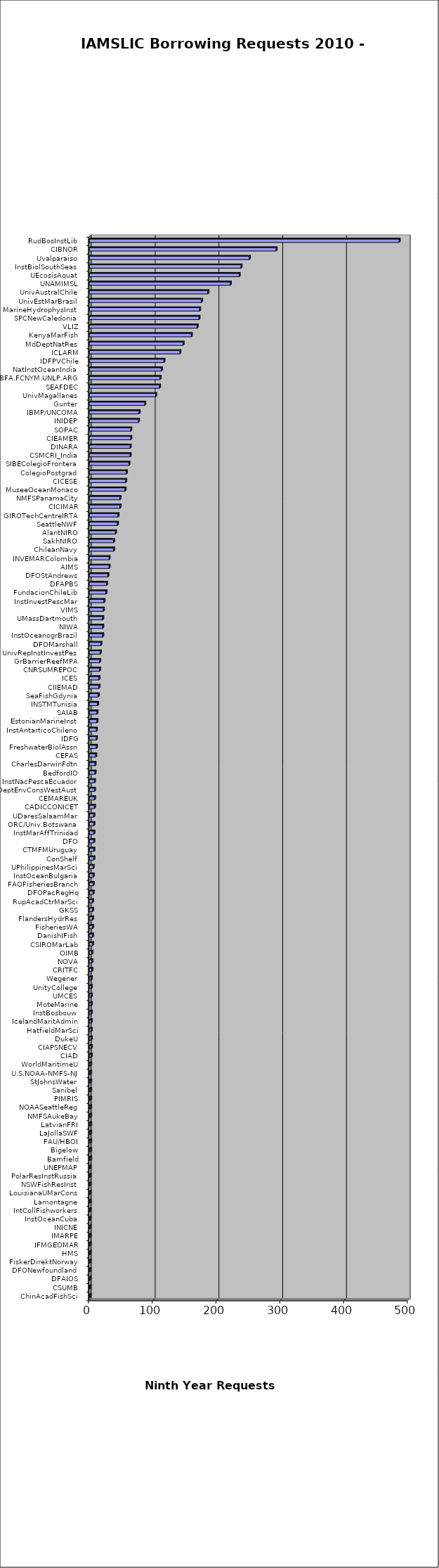
| Category | Series 0 |
|---|---|
| ChinAcadFishSci  | 1 |
| CSUMB  | 1 |
| DFAIOS  | 1 |
| DFONewfoundland  | 1 |
| FiskerDirektNorway  | 1 |
| HMS  | 1 |
| IFMGEOMAR  | 1 |
| IMARPE  | 1 |
| INICNE  | 1 |
| InstOceanCuba  | 1 |
| IntCollFishworkers  | 1 |
| Lamontagne  | 1 |
| LouisianaUMarCons  | 1 |
| NSWFishResInst  | 1 |
| PolarResInstRussia  | 1 |
| UNEPMAP  | 1 |
| Bamfield  | 2 |
| Bigelow  | 2 |
| FAU/HBOI  | 2 |
| LaJollaSWF  | 2 |
| LatvianFRI  | 2 |
| NMFSAukeBay  | 2 |
| NOAASeattleReg  | 2 |
| PIMRIS  | 2 |
| Sanibel  | 2 |
| StJohnsWater  | 2 |
| U.S.NOAA-NMFS-NJ  | 2 |
| WorldMaritimeU  | 2 |
| CIAD  | 3 |
| CIAPSNECV  | 3 |
| DukeU  | 3 |
| HatfieldMarSci  | 3 |
| IcelandMaritAdmin  | 3 |
| InstBosbouw  | 3 |
| MoteMarine  | 3 |
| UMCES  | 3 |
| UnityCollege  | 3 |
| Wegener  | 3 |
| CRITFC  | 4 |
| NOVA  | 4 |
| OIMB  | 4 |
| CSIROMarLab  | 5 |
| DanishIFish  | 5 |
| FisheriesWA  | 5 |
| FlandersHydrRes  | 5 |
| GKSS  | 5 |
| RupAcadCtrMarSci  | 5 |
| DFOPacRegHq  | 6 |
| FAOFisheriesBranch  | 6 |
| InstOceanBulgaria  | 6 |
| UPhilippinesMarSci  | 6 |
| ConShelf  | 7 |
| CTMFMUruguay  | 7 |
| DFO  | 7 |
| InstMarAffTrinidad  | 7 |
| ORC/Univ.Botswana  | 7 |
| UDaresSalaamMar  | 7 |
| CADICCONICET  | 8 |
| CEMAREUK  | 8 |
| DeptEnvConsWestAust  | 8 |
| InstNacPescaEcuador  | 8 |
| BedfordIO  | 9 |
| CharlesDarwinFdtn  | 9 |
| CEFAS  | 10 |
| FreshwaterBiolAssn  | 11 |
| IDFG  | 11 |
| InstAntarticoChileno  | 11 |
| EstonianMarineInst  | 12 |
| SAIAB  | 12 |
| INSTMTunisia  | 13 |
| SeaFishGdynia  | 14 |
| CIIEMAD  | 15 |
| ICES  | 15 |
| CNRSUMREPOC  | 16 |
| GrBarrierReefMPA  | 16 |
| UnivRepInstInvestPes  | 17 |
| DFOMarshall  | 18 |
| InstOceanogrBrazil  | 21 |
| NIWA  | 21 |
| UMassDartmouth  | 21 |
| VIMS  | 22 |
| InstInvestPescMar  | 23 |
| FundacionChileLib  | 26 |
| DFAPBS  | 27 |
| DFOStAndrews  | 29 |
| AIMS  | 31 |
| INVEMARColombia  | 31 |
| ChileanNavy  | 38 |
| SakhNIRO  | 38 |
| AlantNIRO  | 41 |
| SeattleNWF  | 44 |
| GIROTechCentreIRTA  | 45 |
| CICIMAR  | 48 |
| NMFSPanamaCity  | 48 |
| MuseeOceanMonaco  | 56 |
| CICESE  | 57 |
| ColegioPostgrad  | 58 |
| SIBEColegioFrontera  | 62 |
| CSMCRI_India  | 64 |
| DINARA  | 64 |
| CIEAMER  | 65 |
| SOPAC  | 65 |
| INIDEP  | 77 |
| IBMP/UNCOMA  | 78 |
| Gunter  | 87 |
| UnivMagallanes  | 104 |
| SEAFDEC  | 110 |
| BFA.FCNYM.UNLP.ARG  | 111 |
| NatInstOceanIndia  | 113 |
| IDFPVChile  | 117 |
| ICLARM  | 142 |
| MdDeptNatRes  | 147 |
| KenyaMarFish  | 160 |
| VLIZ  | 169 |
| SPCNewCaledonia  | 172 |
| MarineHydrophysInst  | 173 |
| UnivEstMarBrasil  | 176 |
| UnivAustralChile  | 186 |
| UNAMIMSL  | 221 |
| UEcosisAquat  | 235 |
| InstBiolSouthSeas  | 238 |
| Uvalparaiso  | 251 |
| CIBNOR  | 293 |
| RudBosInstLib  | 486 |